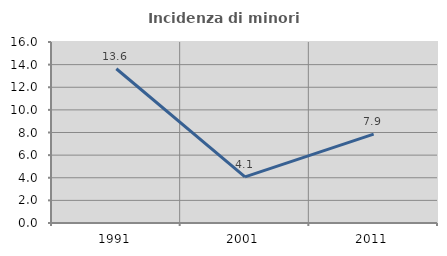
| Category | Incidenza di minori stranieri |
|---|---|
| 1991.0 | 13.636 |
| 2001.0 | 4.082 |
| 2011.0 | 7.853 |